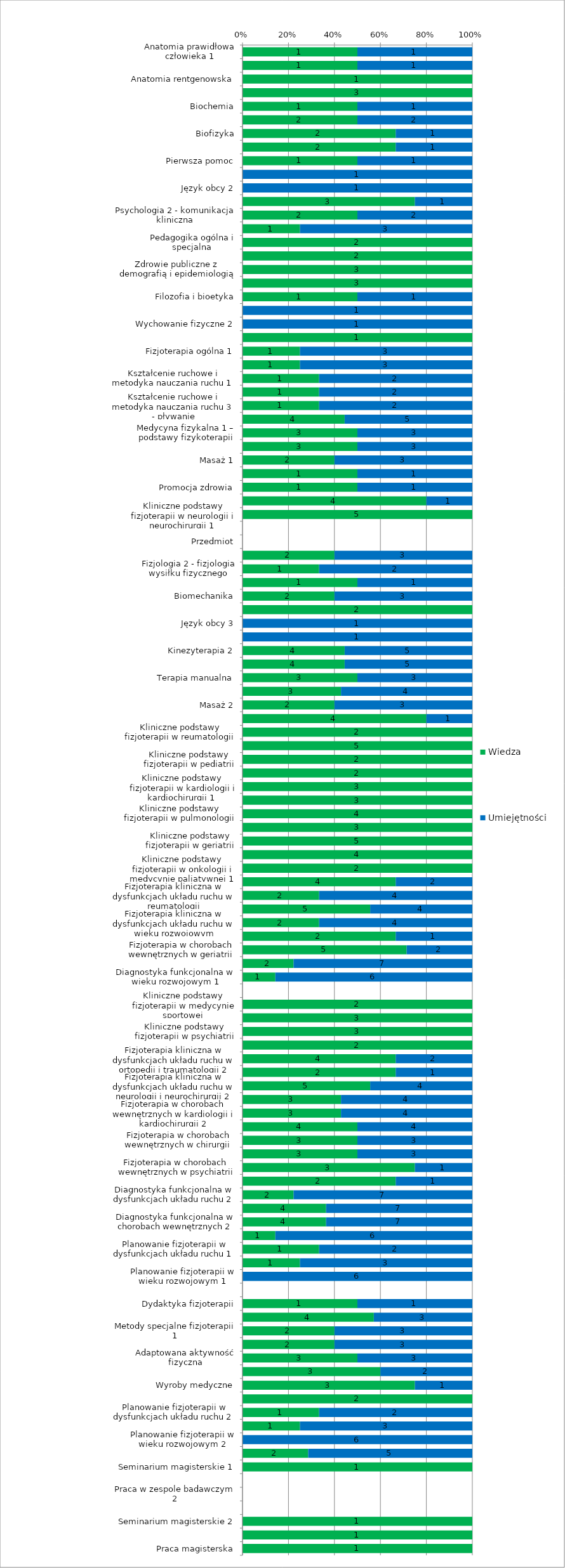
| Category | Wiedza | Umiejętności |
|---|---|---|
| Anatomia prawidłowa człowieka 1 | 1 | 1 |
| Anatomia prawidłowa człowieka 2 | 1 | 1 |
| Anatomia rentgenowska | 1 | 0 |
| Biologia medyczna z genetyką | 3 | 0 |
| Biochemia | 1 | 1 |
| Fizjologia 1 - fizjologia ogólna, fizjologia bólu i diagnostyka fizjologiczna | 2 | 2 |
| Biofizyka | 2 | 1 |
| Ergonomia | 2 | 1 |
| Pierwsza pomoc | 1 | 1 |
| Język obcy 1 | 0 | 1 |
| Język obcy 2 | 0 | 1 |
| Psychologia 1 - psychologia ogólna, kliniczna i psychoterapia | 3 | 1 |
| Psychologia 2 - komunikacja kliniczna | 2 | 2 |
| Socjologia ogólna i niepełnosprawności | 1 | 3 |
| Pedagogika ogólna i specjalna | 2 | 0 |
| Podstawy prawa | 2 | 0 |
| Zdrowie publiczne z demografią i epidemiologią | 3 | 0 |
| Ekonomia, system ochrony zdrowia i technologie informacyjne | 3 | 0 |
| Filozofia i bioetyka | 1 | 1 |
| Wychowanie fizyczne 1 | 0 | 1 |
| Wychowanie fizyczne 2 | 0 | 1 |
| Historia fizjoterapii | 1 | 0 |
| Fizjoterapia ogólna 1 | 1 | 3 |
| Fizjoterapia ogólna 2 | 1 | 3 |
| Kształcenie ruchowe i metodyka nauczania ruchu 1 | 1 | 2 |
| Kształcenie ruchowe i metodyka nauczania ruchu 2 | 1 | 2 |
| Kształcenie ruchowe i metodyka nauczania ruchu 3 - pływanie | 1 | 2 |
| Kinezyterapia 1 | 4 | 5 |
| Medycyna fizykalna 1 – podstawy fizykoterapii | 3 | 3 |
| Medycyna fizykalna 2 – nowoczesne metody fizykoterapii | 3 | 3 |
| Masaż 1 | 2 | 3 |
| Fizjoprofilaktyka | 1 | 1 |
| Promocja zdrowia | 1 | 1 |
| Kliniczne podstawy fizjoterapii w ortopedii i traumatologii 1 | 4 | 1 |
| Kliniczne podstawy fizjoterapii w neurologii i neurochirurgii 1 | 5 | 0 |
| Rozwój psychomotoryczny dziecka | 0 | 0 |
| Przedmiot | 0 | 0 |
| Anatomia palpacyjna i funkcjonalna | 2 | 3 |
| Fizjologia 2 - fizjologia wysiłku fizycznego | 1 | 2 |
| Farmakologia w fizjoterapii | 1 | 1 |
| Biomechanika | 2 | 3 |
| Patologia ogólna | 2 | 0 |
| Język obcy 3 | 0 | 1 |
| Język obcy 4 | 0 | 1 |
| Kinezyterapia 2 | 4 | 5 |
| Kinezyterapia 3 | 4 | 5 |
| Terapia manualna | 3 | 3 |
| Medycyna fizykalna 3 – balneoklimatologia i odnowa biologiczna | 3 | 4 |
| Masaż 2 | 2 | 3 |
| Kliniczne podstawy fizjoterapii w ortopedii i traumatologii 2 | 4 | 1 |
| Kliniczne podstawy fizjoterapii w reumatologii | 2 | 0 |
| Kliniczne podstawy fizjoterapii w neurologii i neurochirurgii 2 | 5 | 0 |
| Kliniczne podstawy fizjoterapii w pediatrii | 2 | 0 |
| Kliniczne podstawy fizjoterapii w neurologii dziecięcej | 2 | 0 |
| Kliniczne podstawy fizjoterapii w kardiologii i kardiochirurgii 1 | 3 | 0 |
| Kliniczne podstawy fizjoterapii w kardiologii i kardiochirurgii 2 | 3 | 0 |
| Kliniczne podstawy fizjoterapii w pulmonologii | 4 | 0 |
| Kliniczne podstawy fizjoterapii w ginekologii i położnictwie | 3 | 0 |
| Kliniczne podstawy fizjoterapii w geriatrii | 5 | 0 |
| Kliniczne podstawy fizjoterapii w intensywnej terapii | 4 | 0 |
| Kliniczne podstawy fizjoterapii w onkologii i medycynie paliatywnej 1 | 2 | 0 |
| Fizjoterapia kliniczna w dysfunkcjach układu ruchu w ortopedii i traumatologii 1 | 4 | 2 |
| Fizjoterapia kliniczna w dysfunkcjach układu ruchu w reumatologii | 2 | 4 |
| Fizjoterapia kliniczna w dysfunkcjach układu ruchu w neurologii i neurochirurgii 1 | 5 | 4 |
| Fizjoterapia kliniczna w dysfunkcjach układu ruchu w wieku rozwojowym | 2 | 4 |
| Fizjoterapia w chorobach wewnętrznych w pediatrii | 2 | 1 |
| Fizjoterapia w chorobach wewnętrznych w geriatrii | 5 | 2 |
| Diagnostyka funkcjonalna w dysfunkcjach układu ruchu 1 | 2 | 7 |
| Diagnostyka funkcjonalna w wieku rozwojowym 1 | 1 | 6 |
| Przedmiot | 0 | 0 |
| Kliniczne podstawy fizjoterapii w medycynie sportowej | 2 | 0 |
| Kliniczne podstawy fizjoterapii w chirurgii | 3 | 0 |
| Kliniczne podstawy fizjoterapii w psychiatrii | 3 | 0 |
| Kliniczne podstawy fizjoterapii w onkologii i medycynie paliatywnej 2 | 2 | 0 |
| Fizjoterapia kliniczna w dysfunkcjach układu ruchu w ortopedii i traumatologii 2 | 4 | 2 |
| Fizjoterapia kliniczna w dysfunkcjach układu ruchu w medycynie sportowej 1 | 2 | 1 |
| Fizjoterapia kliniczna w dysfunkcjach układu ruchu w neurologii i neurochirurgii 2 | 5 | 4 |
| Fizjoterapia w chorobach wewnętrznych w kardiologii i kardiochirurgii 1 | 3 | 4 |
| Fizjoterapia w chorobach wewnętrznych w kardiologii i kardiochirurgii 2 | 3 | 4 |
| Fizjoterapia w chorobach wewnętrznych w pulmonologii | 4 | 4 |
| Fizjoterapia w chorobach wewnętrznych w chirurgii  | 3 | 3 |
| Fizjoterapia w chorobach wewnętrznych w ginekologii i położnictwie | 3 | 3 |
| Fizjoterapia w chorobach wewnętrznych w psychiatrii | 3 | 1 |
| Fizjoterapia w chorobach wewnętrznych w onkologii i medycynie paliatywnej | 2 | 1 |
| Diagnostyka funkcjonalna w dysfunkcjach układu ruchu 2 | 2 | 7 |
| Diagnostyka funkcjonalna w chorobach wewnętrznych 1 | 4 | 7 |
| Diagnostyka funkcjonalna w chorobach wewnętrznych 2 | 4 | 7 |
| Diagnostyka funkcjonalna w wieku rozwojowym 2 | 1 | 6 |
| Planowanie fizjoterapii w dysfunkcjach układu ruchu 1 | 1 | 2 |
| Planowanie fizjoterapii w chorobach wewnętrznych 1 | 1 | 3 |
| Planowanie fizjoterapii w wieku rozwojowym 1 | 0 | 6 |
| Przedmiot | 0 | 0 |
| Dydaktyka fizjoterapii | 1 | 1 |
| Zarządzanie i marketing | 4 | 3 |
| Metody specjalne fizjoterapii 1 | 2 | 3 |
| Metody specjalne fizjoterapii 2 | 2 | 3 |
| Adaptowana aktywność fizyczna | 3 | 3 |
| Sport osób z niepełnosprawnościami | 3 | 2 |
| Wyroby medyczne | 3 | 1 |
| Fizjoterapia kliniczna w dysfunkcjach układu ruchu w medycynie sportowej 2 | 2 | 0 |
| Planowanie fizjoterapii w dysfunkcjach układu ruchu 2 | 1 | 2 |
| Planowanie fizjoterapii w chorobach wewnętrznych 2 | 1 | 3 |
| Planowanie fizjoterapii w wieku rozwojowym 2 | 0 | 6 |
| Metodologia badań naukowych | 2 | 5 |
| Seminarium magisterskie 1 | 1 | 0 |
| Praca w zespole badawczym 1 | 0 | 0 |
| Praca w zespole badawczym 2 | 0 | 0 |
| Przedmiot | 0 | 0 |
| Seminarium magisterskie 2 | 1 | 0 |
| Seminarium magisterskie 3 | 1 | 0 |
| Praca magisterska | 1 | 0 |